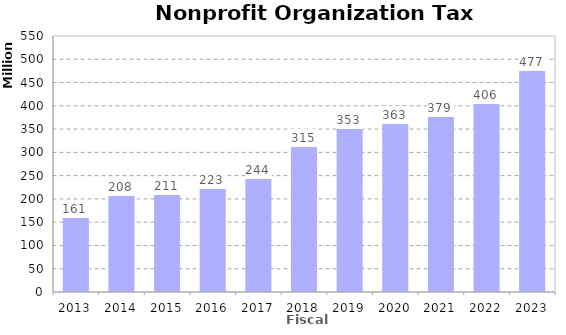
| Category | Amount ($) |
|---|---|
| 2013.0 | 161434467.789 |
| 2014.0 | 208366102.088 |
| 2015.0 | 210994603.365 |
| 2016.0 | 223074819.582 |
| 2017.0 | 244370076.328 |
| 2018.0 | 314543689.447 |
| 2019.0 | 352673576.32 |
| 2020.0 | 362781521.933 |
| 2021.0 | 378603136.285 |
| 2022.0 | 406492802.465 |
| 2023.0 | 477274945.345 |